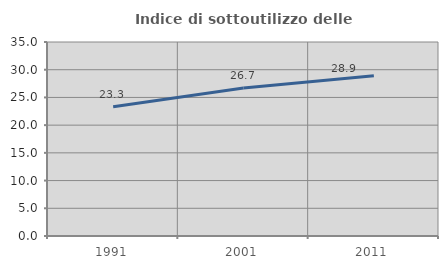
| Category | Indice di sottoutilizzo delle abitazioni  |
|---|---|
| 1991.0 | 23.314 |
| 2001.0 | 26.705 |
| 2011.0 | 28.903 |